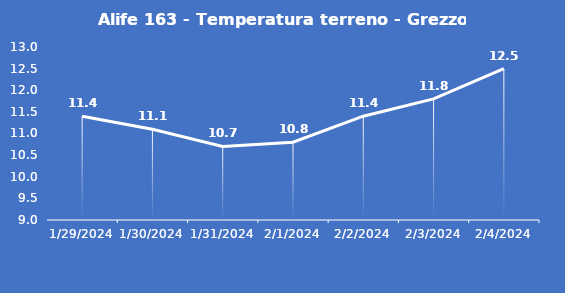
| Category | Alife 163 - Temperatura terreno - Grezzo (°C) |
|---|---|
| 1/29/24 | 11.4 |
| 1/30/24 | 11.1 |
| 1/31/24 | 10.7 |
| 2/1/24 | 10.8 |
| 2/2/24 | 11.4 |
| 2/3/24 | 11.8 |
| 2/4/24 | 12.5 |